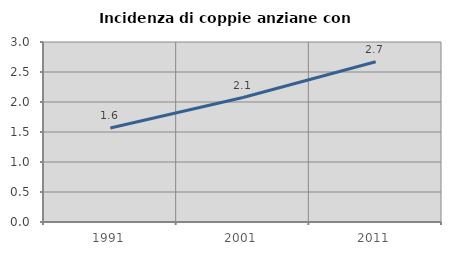
| Category | Incidenza di coppie anziane con figli |
|---|---|
| 1991.0 | 1.566 |
| 2001.0 | 2.074 |
| 2011.0 | 2.672 |